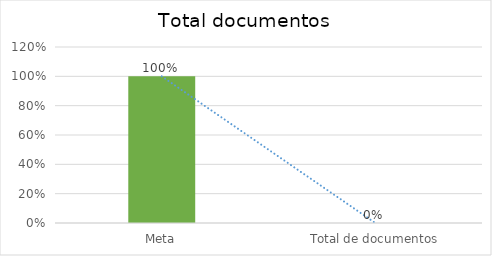
| Category | Series 0 |
|---|---|
| Meta | 1 |
| Total de documentos | 0 |